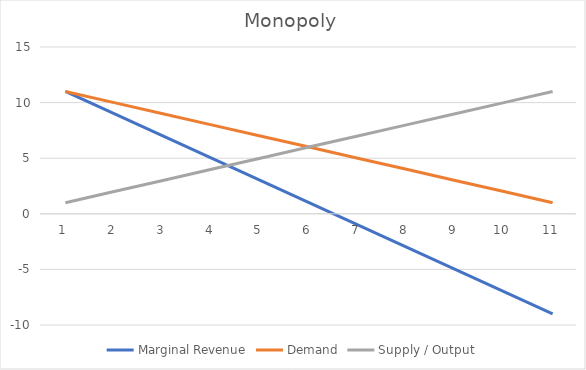
| Category | Marginal Revenue | Demand | Supply / Output |
|---|---|---|---|
| 0 | 11 | 11 | 1 |
| 1 | 9 | 10 | 2 |
| 2 | 7 | 9 | 3 |
| 3 | 5 | 8 | 4 |
| 4 | 3 | 7 | 5 |
| 5 | 1 | 6 | 6 |
| 6 | -1 | 5 | 7 |
| 7 | -3 | 4 | 8 |
| 8 | -5 | 3 | 9 |
| 9 | -7 | 2 | 10 |
| 10 | -9 | 1 | 11 |